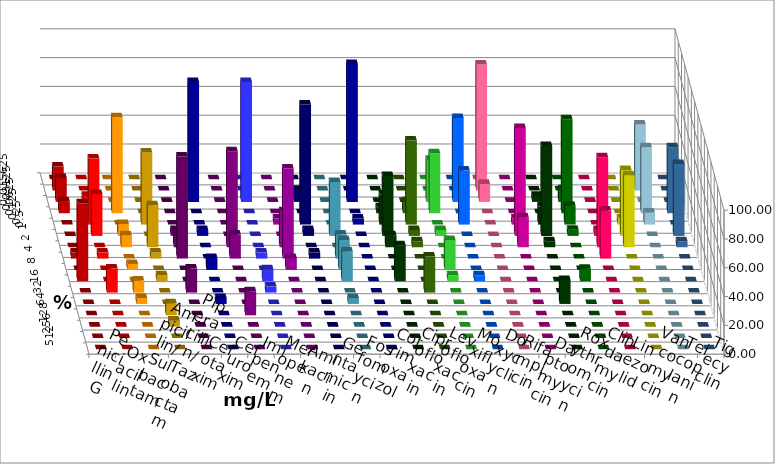
| Category | Penicillin G | Oxacillin | Ampicillin/ Sulbactam | Piperacillin/ Tazobactam | Cefotaxim | Cefuroxim | Imipenem | Meropenem | Amikacin | Gentamicin | Fosfomycin | Cotrimoxazol | Ciprofloxacin | Levofloxacin | Moxifloxacin | Doxycyclin | Rifampicin | Daptomycin | Roxythromycin | Clindamycin | Linezolid | Vancomycin | Teicoplanin | Tigecyclin |
|---|---|---|---|---|---|---|---|---|---|---|---|---|---|---|---|---|---|---|---|---|---|---|---|---|
| 0.015625 | 0 | 0 | 0 | 0 | 0 | 0 | 0 | 0 | 0 | 0 | 0 | 0 | 0 | 0 | 0 | 0 | 0 | 0 | 0 | 0 | 0 | 0 | 0 | 0 |
| 0.03125 | 16.667 | 0 | 0 | 0 | 0 | 0 | 0 | 0 | 0 | 0 | 0 | 0 | 0 | 0 | 0 | 0 | 87.5 | 0 | 0 | 0 | 0 | 0 | 0 | 45.833 |
| 0.0625 | 16.667 | 4.167 | 0 | 0 | 0 | 0 | 83.333 | 83.333 | 0 | 8.333 | 0 | 95.833 | 0 | 0 | 29.167 | 58.333 | 12.5 | 0 | 4.167 | 8.696 | 0 | 0 | 0 | 0 |
| 0.125 | 8.333 | 0 | 66.667 | 0 | 0 | 0 | 0 | 0 | 0 | 0 | 0 | 0 | 4.167 | 8.333 | 41.667 | 0 | 0 | 0 | 0 | 65.217 | 0 | 0 | 45.833 | 45.833 |
| 0.25 | 0 | 45.833 | 0 | 50 | 0 | 0 | 0 | 0 | 4.167 | 83.333 | 0 | 4.167 | 20.833 | 58.333 | 0 | 37.5 | 0 | 4.167 | 12.5 | 13.043 | 0 | 4.167 | 0 | 8.333 |
| 0.5 | 0 | 29.167 | 8.333 | 0 | 4.167 | 0 | 4.167 | 0 | 0 | 4.167 | 37.5 | 0 | 41.667 | 4.167 | 4.167 | 0 | 0 | 75 | 62.5 | 4.348 | 4.167 | 45.833 | 50 | 0 |
| 1.0 | 0 | 0 | 8.333 | 29.167 | 8.333 | 66.667 | 0 | 0 | 25 | 0 | 0 | 0 | 8.333 | 4.167 | 0 | 0 | 0 | 20.833 | 4.167 | 0 | 62.5 | 50 | 4.167 | 0 |
| 2.0 | 4.167 | 4.167 | 0 | 4.167 | 70.833 | 16.667 | 0 | 4.167 | 62.5 | 4.167 | 16.667 | 0 | 0 | 0 | 0 | 0 | 0 | 0 | 0 | 0 | 33.333 | 0 | 0 | 0 |
| 4.0 | 0 | 0 | 4.167 | 0 | 0 | 0 | 8.333 | 0 | 8.333 | 0 | 20.833 | 0 | 0 | 0 | 20.833 | 0 | 0 | 0 | 0 | 0 | 0 | 0 | 0 | 0 |
| 8.0 | 54.167 | 0 | 0 | 4.167 | 0 | 0 | 0 | 8.333 | 0 | 0 | 20.833 | 0 | 25 | 0 | 4.167 | 4.167 | 0 | 0 | 0 | 8.696 | 0 | 0 | 0 | 0 |
| 16.0 | 0 | 16.667 | 8.333 | 0 | 16.667 | 0 | 0 | 4.167 | 0 | 0 | 0 | 0 | 0 | 25 | 0 | 0 | 0 | 0 | 0 | 0 | 0 | 0 | 0 | 0 |
| 32.0 | 0 | 0 | 4.167 | 0 | 0 | 0 | 4.167 | 0 | 0 | 0 | 4.167 | 0 | 0 | 0 | 0 | 0 | 0 | 0 | 16.667 | 0 | 0 | 0 | 0 | 0 |
| 64.0 | 0 | 0 | 0 | 8.333 | 0 | 16.667 | 0 | 0 | 0 | 0 | 0 | 0 | 0 | 0 | 0 | 0 | 0 | 0 | 0 | 0 | 0 | 0 | 0 | 0 |
| 128.0 | 0 | 0 | 0 | 4.167 | 0 | 0 | 0 | 0 | 0 | 0 | 0 | 0 | 0 | 0 | 0 | 0 | 0 | 0 | 0 | 0 | 0 | 0 | 0 | 0 |
| 256.0 | 0 | 0 | 0 | 0 | 0 | 0 | 0 | 0 | 0 | 0 | 0 | 0 | 0 | 0 | 0 | 0 | 0 | 0 | 0 | 0 | 0 | 0 | 0 | 0 |
| 512.0 | 0 | 0 | 0 | 0 | 0 | 0 | 0 | 0 | 0 | 0 | 0 | 0 | 0 | 0 | 0 | 0 | 0 | 0 | 0 | 0 | 0 | 0 | 0 | 0 |